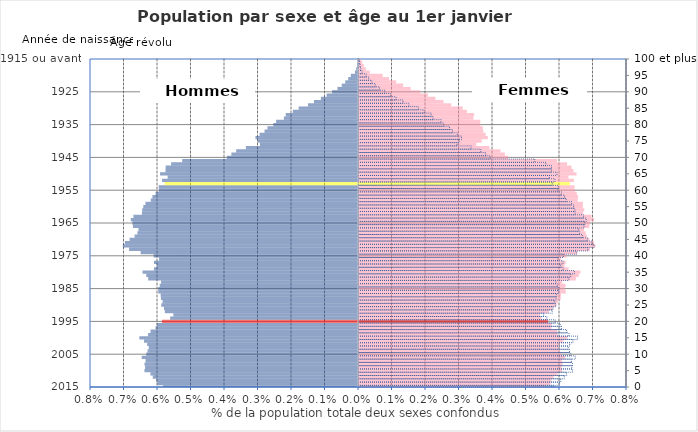
| Category | Hommes | Femmes |
|---|---|---|
| 2015 | -0.006 | 0.006 |
| 2014 | -0.006 | 0.006 |
| 2013 | -0.006 | 0.006 |
| 2012 | -0.006 | 0.006 |
| 2011 | -0.006 | 0.006 |
| 2010 | -0.006 | 0.006 |
| 2009 | -0.006 | 0.006 |
| 2008 | -0.006 | 0.006 |
| 2007 | -0.006 | 0.006 |
| 2006 | -0.006 | 0.006 |
| 2005 | -0.006 | 0.006 |
| 2004 | -0.006 | 0.006 |
| 2003 | -0.006 | 0.006 |
| 2002 | -0.006 | 0.006 |
| 2001 | -0.006 | 0.006 |
| 2000 | -0.007 | 0.006 |
| 1999 | -0.006 | 0.006 |
| 1998 | -0.006 | 0.006 |
| 1997 | -0.006 | 0.006 |
| 1996 | -0.006 | 0.006 |
| 1995 | -0.006 | 0.006 |
| 1994 | -0.006 | 0.005 |
| 1993 | -0.006 | 0.005 |
| 1992 | -0.006 | 0.006 |
| 1991 | -0.006 | 0.006 |
| 1990 | -0.006 | 0.006 |
| 1989 | -0.006 | 0.006 |
| 1988 | -0.006 | 0.006 |
| 1987 | -0.006 | 0.006 |
| 1986 | -0.006 | 0.006 |
| 1985 | -0.006 | 0.006 |
| 1984 | -0.006 | 0.006 |
| 1983 | -0.006 | 0.006 |
| 1982 | -0.006 | 0.006 |
| 1981 | -0.006 | 0.007 |
| 1980 | -0.006 | 0.007 |
| 1979 | -0.006 | 0.006 |
| 1978 | -0.006 | 0.006 |
| 1977 | -0.006 | 0.006 |
| 1976 | -0.006 | 0.006 |
| 1975 | -0.006 | 0.006 |
| 1974 | -0.006 | 0.007 |
| 1973 | -0.007 | 0.007 |
| 1972 | -0.007 | 0.007 |
| 1971 | -0.007 | 0.007 |
| 1970 | -0.007 | 0.007 |
| 1969 | -0.007 | 0.007 |
| 1968 | -0.007 | 0.007 |
| 1967 | -0.007 | 0.007 |
| 1966 | -0.007 | 0.007 |
| 1965 | -0.007 | 0.007 |
| 1964 | -0.007 | 0.007 |
| 1963 | -0.007 | 0.007 |
| 1962 | -0.006 | 0.007 |
| 1961 | -0.006 | 0.007 |
| 1960 | -0.006 | 0.007 |
| 1959 | -0.006 | 0.007 |
| 1958 | -0.006 | 0.007 |
| 1957 | -0.006 | 0.007 |
| 1956 | -0.006 | 0.007 |
| 1955 | -0.006 | 0.006 |
| 1954 | -0.006 | 0.006 |
| 1953 | -0.006 | 0.006 |
| 1952 | -0.006 | 0.006 |
| 1951 | -0.006 | 0.006 |
| 1950 | -0.006 | 0.006 |
| 1949 | -0.006 | 0.006 |
| 1948 | -0.006 | 0.006 |
| 1947 | -0.006 | 0.006 |
| 1946 | -0.005 | 0.006 |
| 1945 | -0.004 | 0.004 |
| 1944 | -0.004 | 0.004 |
| 1943 | -0.004 | 0.004 |
| 1942 | -0.003 | 0.004 |
| 1941 | -0.003 | 0.004 |
| 1940 | -0.003 | 0.004 |
| 1939 | -0.003 | 0.004 |
| 1938 | -0.003 | 0.004 |
| 1937 | -0.003 | 0.004 |
| 1936 | -0.003 | 0.004 |
| 1935 | -0.003 | 0.004 |
| 1934 | -0.002 | 0.004 |
| 1933 | -0.002 | 0.003 |
| 1932 | -0.002 | 0.003 |
| 1931 | -0.002 | 0.003 |
| 1930 | -0.002 | 0.003 |
| 1929 | -0.001 | 0.003 |
| 1928 | -0.001 | 0.003 |
| 1927 | -0.001 | 0.002 |
| 1926 | -0.001 | 0.002 |
| 1925 | -0.001 | 0.002 |
| 1924 | -0.001 | 0.002 |
| 1923 | 0 | 0.001 |
| 1922 | 0 | 0.001 |
| 1921 | 0 | 0.001 |
| 1920 | 0 | 0.001 |
| 1919 | 0 | 0 |
| 1918 | 0 | 0 |
| 1917 | 0 | 0 |
| 1916 | 0 | 0 |
| 1915 ou avant | 0 | 0 |